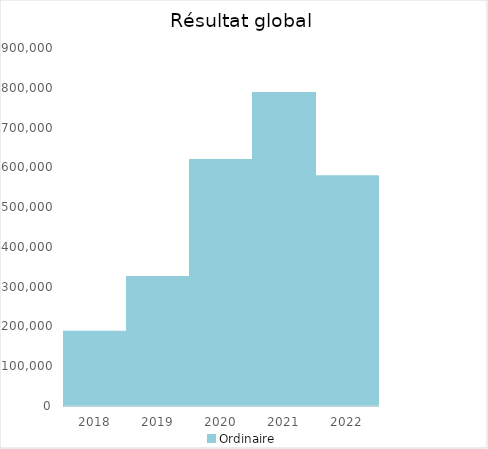
| Category |   | Ordinaire |    |
|---|---|---|---|
| 2018.0 |  | 186615 |  |
| 2019.0 |  | 324102.44 |  |
| 2020.0 |  | 618414.04 |  |
| 2021.0 |  | 787065 |  |
| 2022.0 |  | 577420.58 |  |